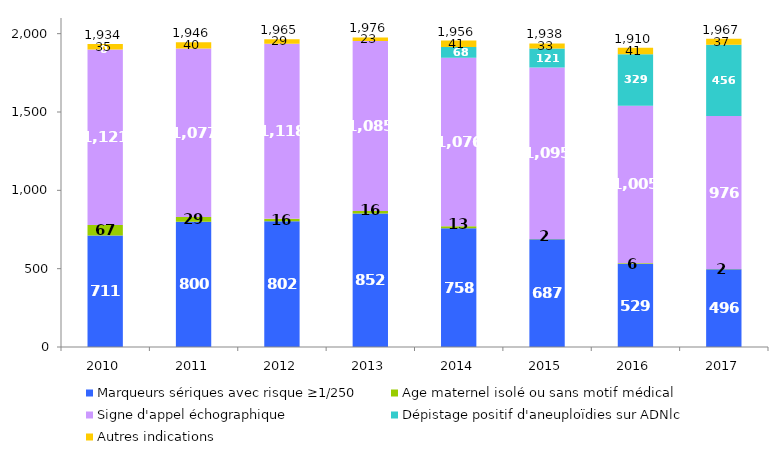
| Category | Marqueurs sériques avec risque ≥1/250 | Age maternel isolé ou sans motif médical | Signe d'appel échographique | Dépistage positif d'aneuploïdies sur ADNlc | Autres indications | Total |
|---|---|---|---|---|---|---|
| 2010.0 | 711 | 67 | 1121 | 0 | 35 | 1934 |
| 2011.0 | 800 | 29 | 1077 | 0 | 40 | 1946 |
| 2012.0 | 802 | 16 | 1118 | 0 | 29 | 1965 |
| 2013.0 | 852 | 16 | 1085 | 0 | 23 | 1976 |
| 2014.0 | 758 | 13 | 1076 | 68 | 41 | 1956 |
| 2015.0 | 687 | 2 | 1095 | 121 | 33 | 1938 |
| 2016.0 | 529 | 6 | 1005 | 329 | 41 | 1910 |
| 2017.0 | 496 | 2 | 976 | 456 | 37 | 1967 |